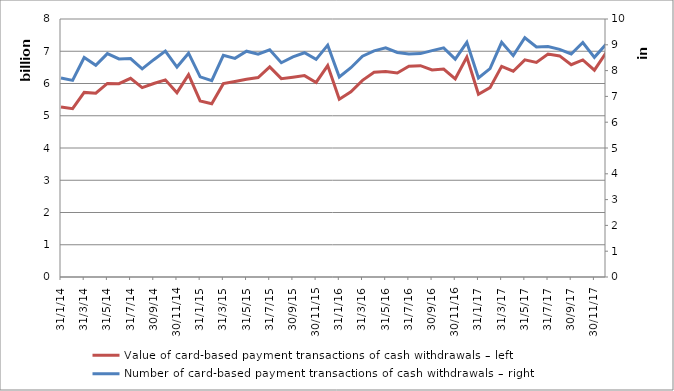
| Category | Value of card-based payment transactions of cash withdrawals – left |
|---|---|
| 2014-01-31 | 5272832195 |
| 2014-02-28 | 5217719073 |
| 2014-03-31 | 5724015061 |
| 2014-04-30 | 5698926512 |
| 2014-05-31 | 6001990751 |
| 2014-06-30 | 5993565769 |
| 2014-07-31 | 6160371954 |
| 2014-08-31 | 5870871418 |
| 2014-09-30 | 6000906784 |
| 2014-10-31 | 6113250340 |
| 2014-11-30 | 5715360378 |
| 2014-12-31 | 6276631519 |
| 2015-01-31 | 5458088979 |
| 2015-02-28 | 5373333911 |
| 2015-03-31 | 5996120795 |
| 2015-04-30 | 6061776852 |
| 2015-05-31 | 6134160830 |
| 2015-06-30 | 6184116986 |
| 2015-07-31 | 6513775021 |
| 2015-08-31 | 6150274026 |
| 2015-09-30 | 6195261234 |
| 2015-10-31 | 6243935908 |
| 2015-11-30 | 6032039906 |
| 2015-12-31 | 6556319206 |
| 2016-01-31 | 5514464401 |
| 2016-02-29 | 5741517621 |
| 2016-03-31 | 6097170475 |
| 2016-04-30 | 6346534978 |
| 2016-05-31 | 6370574517 |
| 2016-06-30 | 6327736639 |
| 2016-07-31 | 6535488468 |
| 2016-08-31 | 6551751429 |
| 2016-09-30 | 6421891372 |
| 2016-10-31 | 6450142057 |
| 2016-11-30 | 6145659859 |
| 2016-12-31 | 6819331904 |
| 2017-01-31 | 5666038801 |
| 2017-02-28 | 5872617770 |
| 2017-03-31 | 6532401746 |
| 2017-04-30 | 6381224799 |
| 2017-05-31 | 6733357752 |
| 2017-06-30 | 6652542580 |
| 2017-07-31 | 6911790845 |
| 2017-08-31 | 6854972720 |
| 2017-09-30 | 6582349265 |
| 2017-10-31 | 6730793169 |
| 2017-11-30 | 6412821254 |
| 2017-12-31 | 6954726818 |